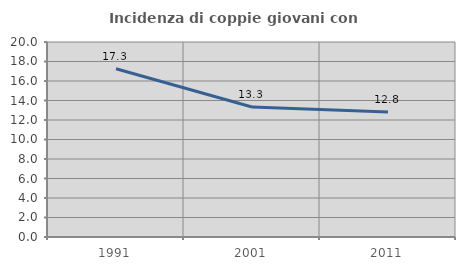
| Category | Incidenza di coppie giovani con figli |
|---|---|
| 1991.0 | 17.256 |
| 2001.0 | 13.333 |
| 2011.0 | 12.827 |